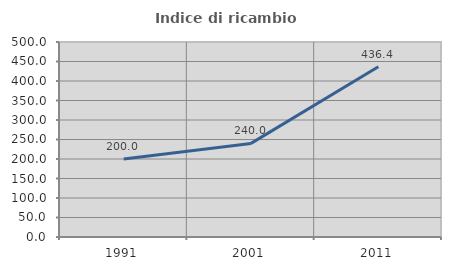
| Category | Indice di ricambio occupazionale  |
|---|---|
| 1991.0 | 200 |
| 2001.0 | 240 |
| 2011.0 | 436.364 |